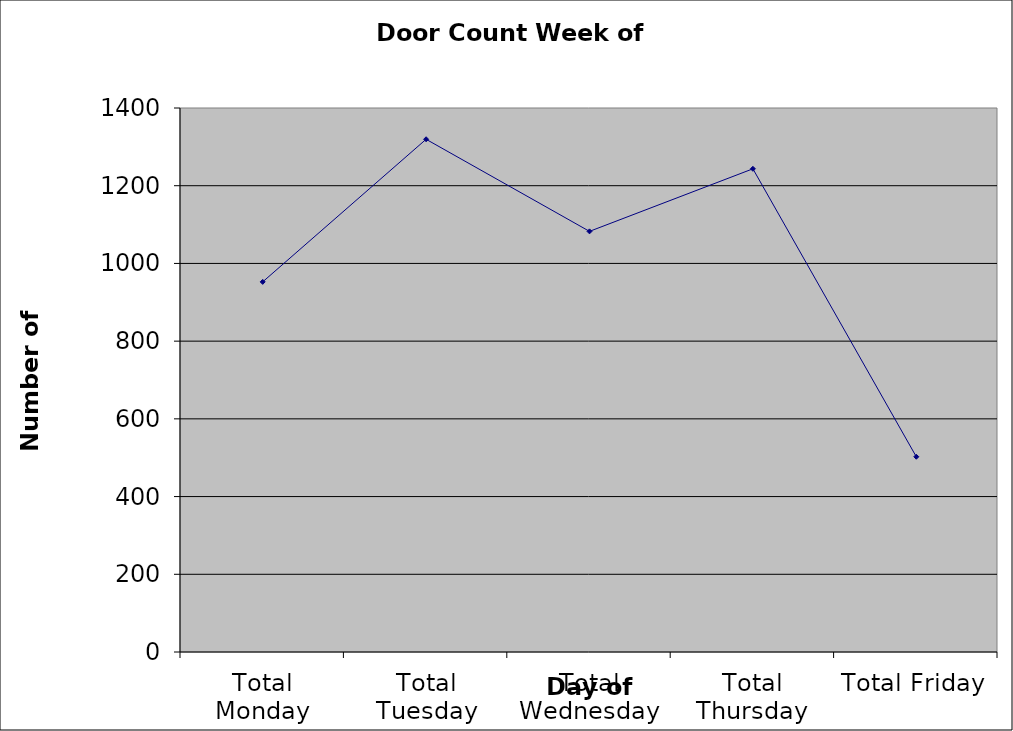
| Category | Series 0 |
|---|---|
| Total Monday | 952.5 |
| Total Tuesday | 1319.5 |
| Total Wednesday | 1082.5 |
| Total Thursday | 1243.5 |
| Total Friday | 502.5 |